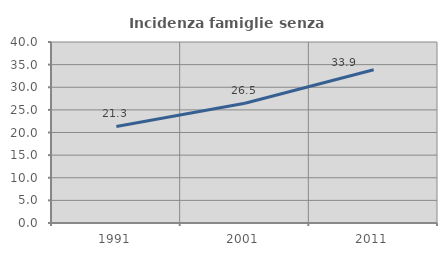
| Category | Incidenza famiglie senza nuclei |
|---|---|
| 1991.0 | 21.348 |
| 2001.0 | 26.48 |
| 2011.0 | 33.85 |